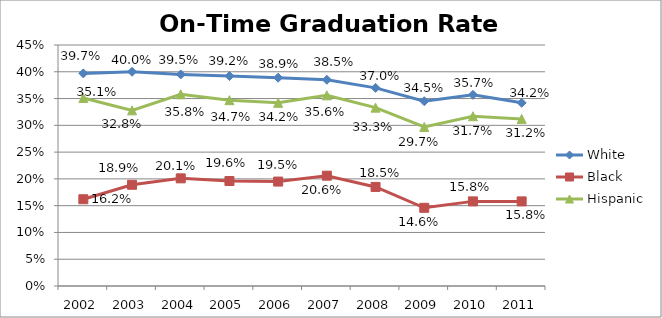
| Category | White | Black | Hispanic |
|---|---|---|---|
| 2002.0 | 0.397 | 0.162 | 0.351 |
| 2003.0 | 0.4 | 0.189 | 0.328 |
| 2004.0 | 0.395 | 0.201 | 0.358 |
| 2005.0 | 0.392 | 0.196 | 0.347 |
| 2006.0 | 0.389 | 0.195 | 0.342 |
| 2007.0 | 0.385 | 0.206 | 0.356 |
| 2008.0 | 0.37 | 0.185 | 0.333 |
| 2009.0 | 0.345 | 0.146 | 0.297 |
| 2010.0 | 0.357 | 0.158 | 0.317 |
| 2011.0 | 0.342 | 0.158 | 0.312 |